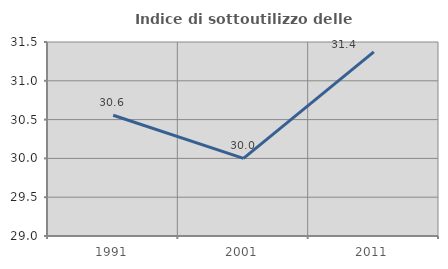
| Category | Indice di sottoutilizzo delle abitazioni  |
|---|---|
| 1991.0 | 30.556 |
| 2001.0 | 30 |
| 2011.0 | 31.373 |